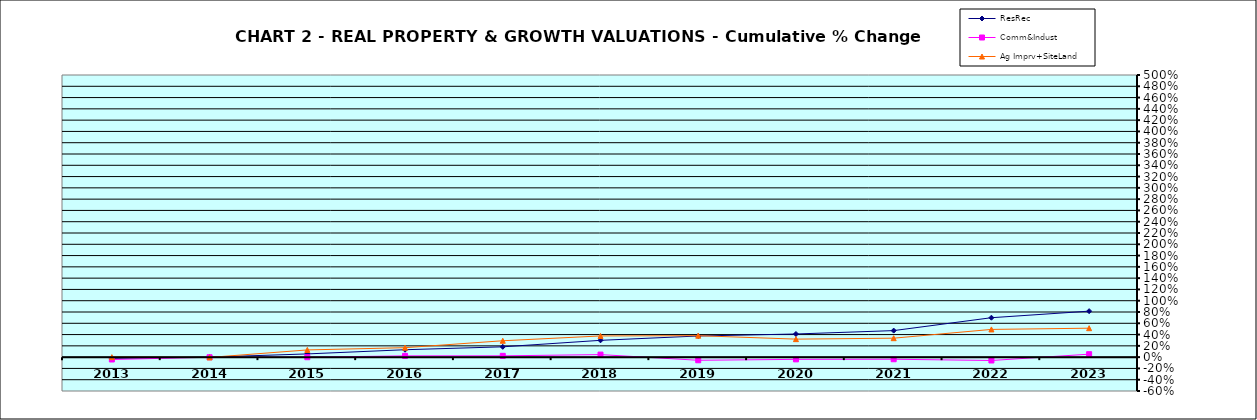
| Category | ResRec | Comm&Indust | Ag Imprv+SiteLand |
|---|---|---|---|
| 2013.0 | -0.021 | -0.042 | 0 |
| 2014.0 | 0 | -0.002 | -0.005 |
| 2015.0 | 0.057 | -0.002 | 0.128 |
| 2016.0 | 0.131 | 0.023 | 0.168 |
| 2017.0 | 0.183 | 0.023 | 0.29 |
| 2018.0 | 0.298 | 0.045 | 0.376 |
| 2019.0 | 0.375 | -0.055 | 0.38 |
| 2020.0 | 0.41 | -0.039 | 0.319 |
| 2021.0 | 0.47 | -0.037 | 0.336 |
| 2022.0 | 0.699 | -0.059 | 0.491 |
| 2023.0 | 0.815 | 0.052 | 0.513 |